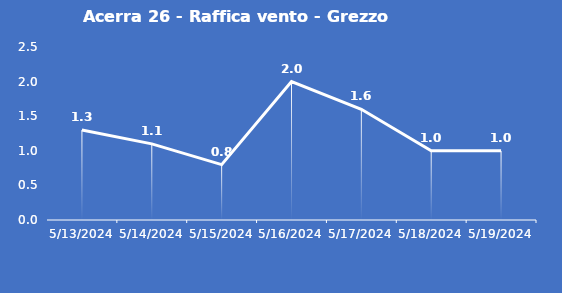
| Category | Acerra 26 - Raffica vento - Grezzo (m/s) |
|---|---|
| 5/13/24 | 1.3 |
| 5/14/24 | 1.1 |
| 5/15/24 | 0.8 |
| 5/16/24 | 2 |
| 5/17/24 | 1.6 |
| 5/18/24 | 1 |
| 5/19/24 | 1 |